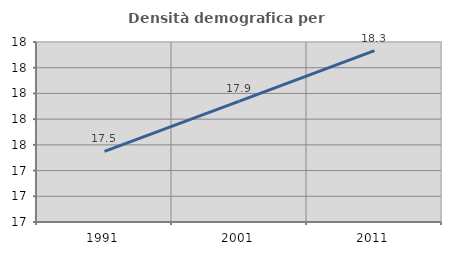
| Category | Densità demografica |
|---|---|
| 1991.0 | 17.549 |
| 2001.0 | 17.941 |
| 2011.0 | 18.332 |